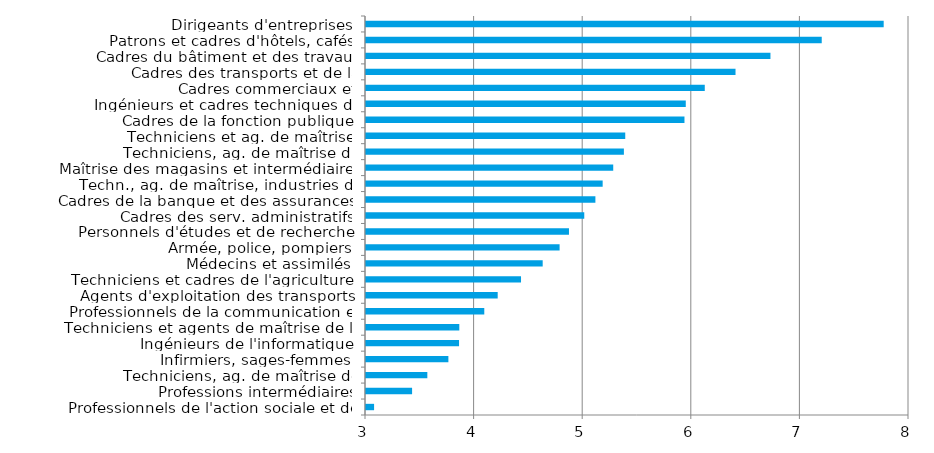
| Category | Series 0 |
|---|---|
| Professionnels de l'action sociale et de l'orientation | 3.074 |
| Professions intermédiaires administratives de la fonction publique (catégorie B et assimil | 3.424 |
| Techniciens, ag. de maîtrise de l'électricité-électronique | 3.565 |
| Infirmiers, sages-femmes | 3.759 |
| Ingénieurs de l'informatique | 3.857 |
| Techniciens et agents de maîtrise de la maintenance | 3.859 |
| Professionnels de la communication et de l'information | 4.089 |
| Agents d'exploitation des transports | 4.213 |
| Techniciens et cadres de l'agriculture | 4.427 |
| Médecins et assimilés | 4.627 |
| Armée, police, pompiers | 4.783 |
| Personnels d'études et de recherche | 4.869 |
| Cadres des serv. administratifs, comptables et financiers | 5.01 |
| Cadres de la banque et des assurances | 5.112 |
| Techn., ag. de maîtrise, industries de process | 5.179 |
| Maîtrise des magasins et intermédiaires du commerce | 5.276 |
| Techniciens, ag. de maîtrise du bâtiment et  tr. publics | 5.375 |
| Techniciens et ag. de maîtrise, industries mécaniques | 5.387 |
| Cadres de la fonction publique | 5.932 |
| Ingénieurs et cadres techniques de l'industrie | 5.945 |
| Cadres commerciaux et technico-commerciaux | 6.119 |
| Cadres des transports et de la logistique  | 6.403 |
| Cadres du bâtiment et des travaux publics | 6.724 |
| Patrons et cadres d'hôtels, cafés, restaurants | 7.196 |
| Dirigeants d'entreprises | 7.767 |